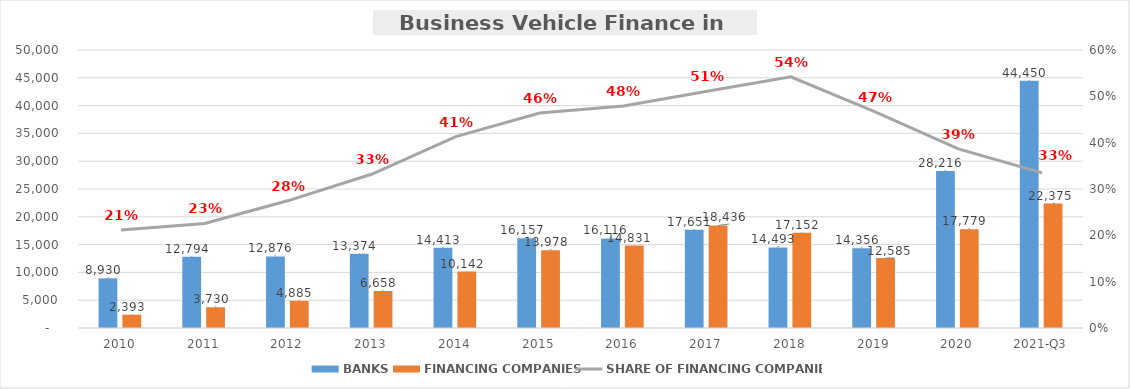
| Category | BANKS | FINANCING COMPANIES |
|---|---|---|
| 2010 | 8930.131 | 2392.721 |
| 2011 | 12793.723 | 3729.987 |
| 2012 | 12876.346 | 4885.495 |
| 2013 | 13374.424 | 6657.806 |
| 2014 | 14412.767 | 10141.887 |
| 2015 | 16157.225 | 13978.426 |
| 2016 | 16116.463 | 14831.249 |
| 2017 | 17650.963 | 18436.034 |
| 2018 | 14492.83 | 17152.034 |
| 2019 | 14355.978 | 12584.792 |
| 2020 | 28216.157 | 17779.072 |
| 2021-Q3 | 44449.855 | 22375.251 |